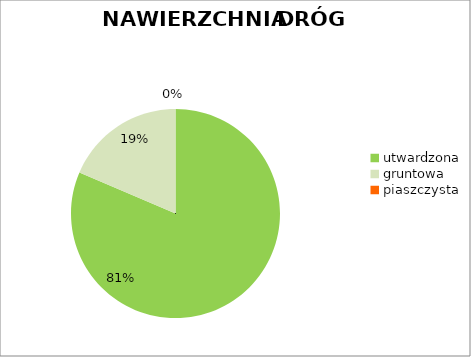
| Category | Series 0 |
|---|---|
| utwardzona | 0.814 |
| gruntowa | 0.186 |
| piaszczysta | 0 |